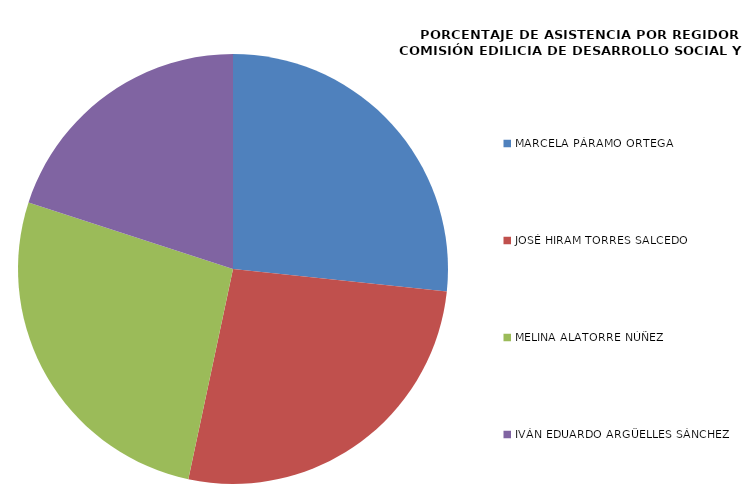
| Category | Series 0 |
|---|---|
| MARCELA PÁRAMO ORTEGA | 100 |
| JOSÉ HIRAM TORRES SALCEDO | 100 |
| MELINA ALATORRE NÚÑEZ | 100 |
| IVÁN EDUARDO ARGÜELLES SÁNCHEZ | 75 |